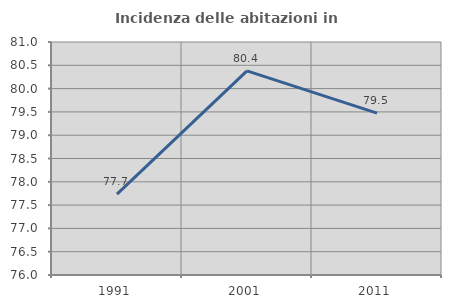
| Category | Incidenza delle abitazioni in proprietà  |
|---|---|
| 1991.0 | 77.737 |
| 2001.0 | 80.38 |
| 2011.0 | 79.473 |